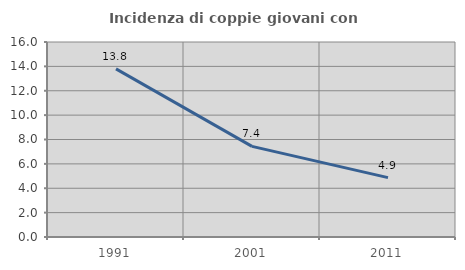
| Category | Incidenza di coppie giovani con figli |
|---|---|
| 1991.0 | 13.796 |
| 2001.0 | 7.434 |
| 2011.0 | 4.873 |